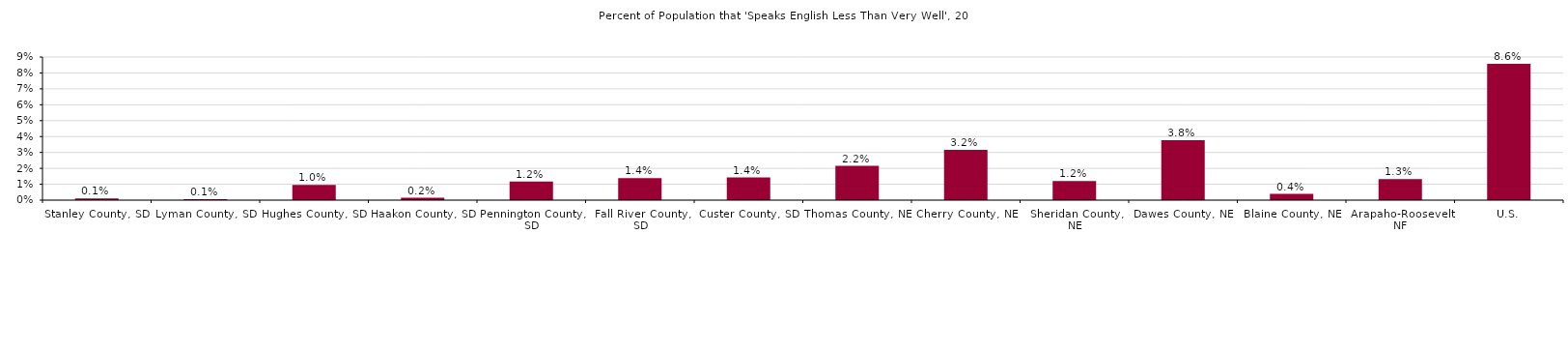
| Category | Speak English less than "very well" |
|---|---|
| Gallatin County, MT | 0.014 |
| County Region | 0.014 |
| U.S. | 0.087 |